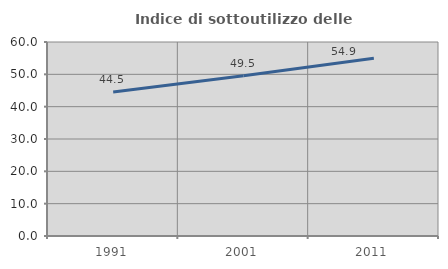
| Category | Indice di sottoutilizzo delle abitazioni  |
|---|---|
| 1991.0 | 44.504 |
| 2001.0 | 49.535 |
| 2011.0 | 54.947 |